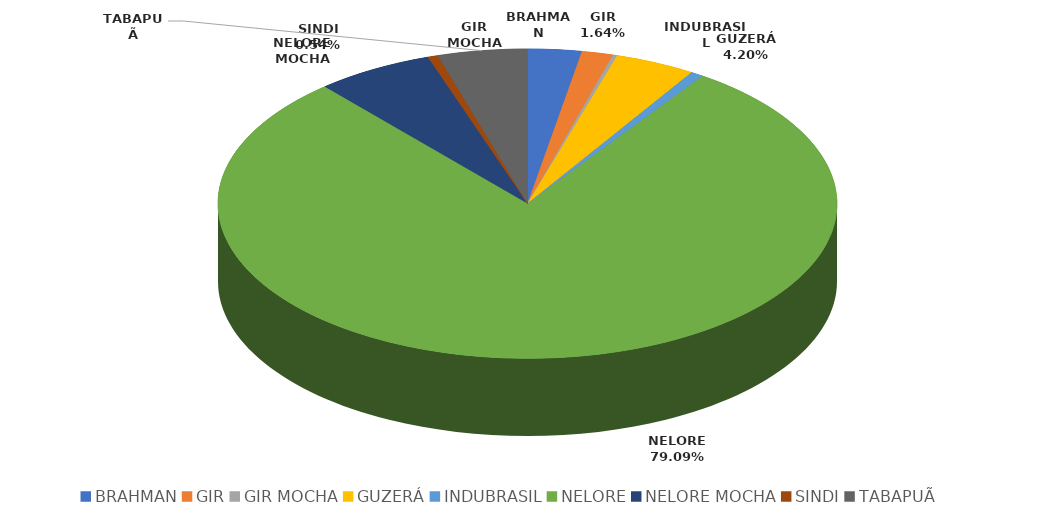
| Category | Series 0 |
|---|---|
| BRAHMAN | 177500 |
| GIR | 103640 |
| GIR MOCHA | 14667 |
| GUZERÁ | 266038 |
| INDUBRASIL | 42836 |
| NELORE | 5004831 |
| NELORE MOCHA | 388844 |
| SINDI | 33875 |
| TABAPUÃ | 295953 |